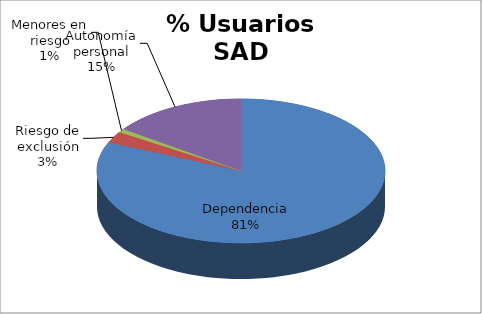
| Category | Series 0 |
|---|---|
| Dependencia | 4282 |
| Riesgo de exclusión | 134 |
| Menores en riesgo | 45 |
| Autonomía personal | 796 |